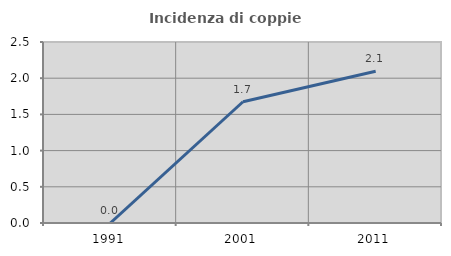
| Category | Incidenza di coppie miste |
|---|---|
| 1991.0 | 0 |
| 2001.0 | 1.675 |
| 2011.0 | 2.097 |